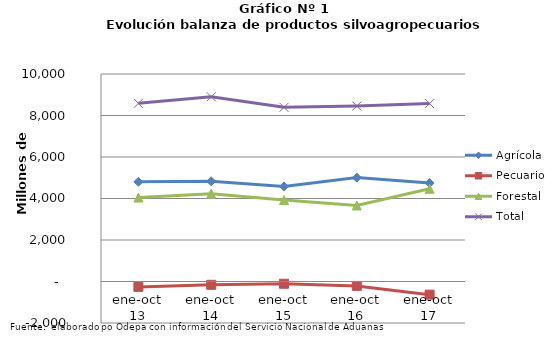
| Category | Agrícola | Pecuario | Forestal | Total |
|---|---|---|---|---|
| ene-oct 13 | 4802968 | -260298 | 4045765 | 8588435 |
| ene-oct 14 | 4829420 | -159559 | 4233958 | 8903819 |
| ene-oct 15 | 4576984 | -109785 | 3926197 | 8393396 |
| ene-oct 16 | 5006662 | -212556 | 3662877 | 8456983 |
| ene-oct 17 | 4743274 | -633772 | 4465698 | 8575200 |